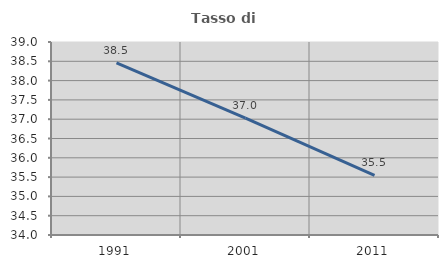
| Category | Tasso di occupazione   |
|---|---|
| 1991.0 | 38.462 |
| 2001.0 | 37.026 |
| 2011.0 | 35.546 |